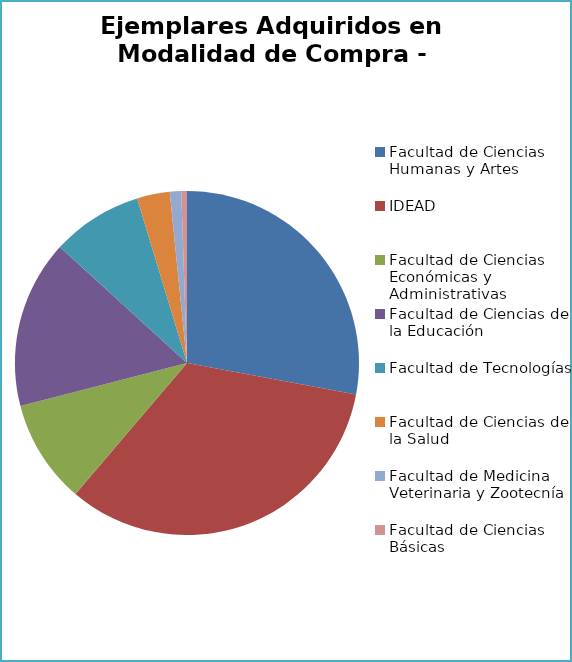
| Category | Series 2 |
|---|---|
| Facultad de Ciencias Humanas y Artes | 209 |
| IDEAD | 249 |
| Facultad de Ciencias Económicas y Administrativas | 73 |
| Facultad de Ciencias de la Educación | 118 |
| Facultad de Tecnologías | 64 |
| Facultad de Ciencias de la Salud | 23 |
| Facultad de Medicina Veterinaria y Zootecnía | 8 |
| Facultad de Ciencias Básicas | 4 |